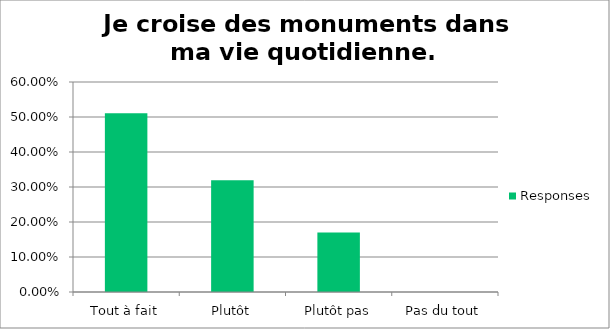
| Category | Responses |
|---|---|
| Tout à fait | 0.511 |
| Plutôt | 0.319 |
| Plutôt pas | 0.17 |
| Pas du tout | 0 |